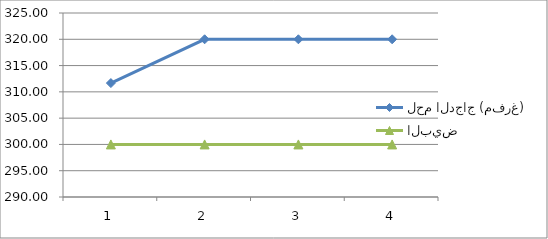
| Category | لحم الدجاج (مفرغ) | البيض |
|---|---|---|
| 0 | 311.67 | 300 |
| 1 | 320 | 300 |
| 2 | 320 | 300 |
| 3 | 320 | 300 |